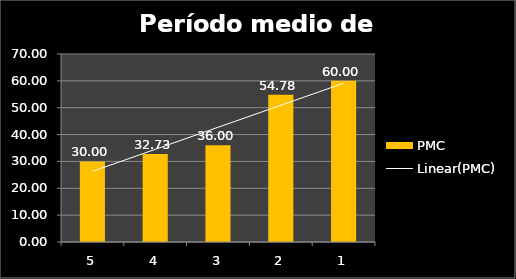
| Category | PMC |
|---|---|
| 5.0 | 30 |
| 4.0 | 32.727 |
| 3.0 | 36 |
| 2.0 | 54.783 |
| 1.0 | 60 |